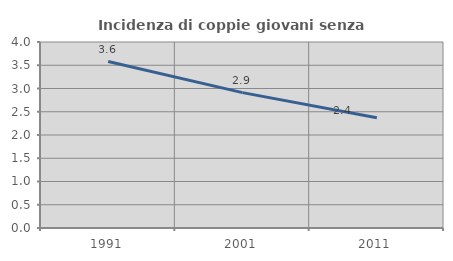
| Category | Incidenza di coppie giovani senza figli |
|---|---|
| 1991.0 | 3.58 |
| 2001.0 | 2.911 |
| 2011.0 | 2.37 |